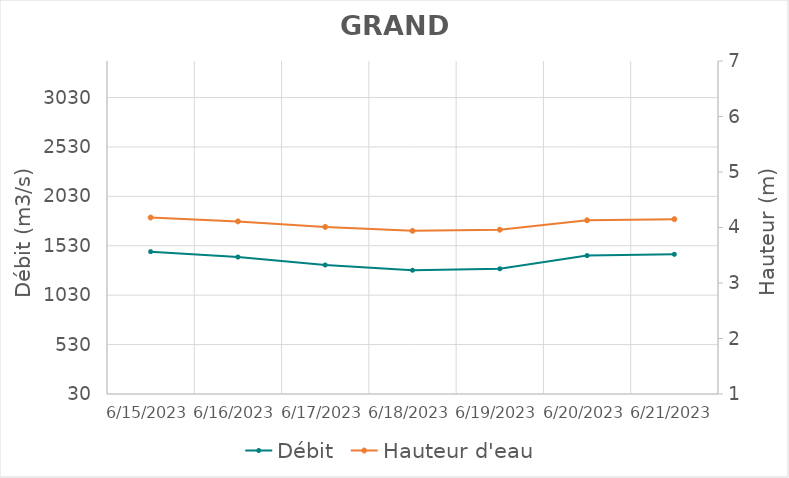
| Category | Débit |
|---|---|
| 6/29/22 | 2068.21 |
| 6/28/22 | 1854.04 |
| 6/27/22 | 1893.75 |
| 6/26/22 | 2018.73 |
| 6/25/22 | 2099.57 |
| 6/24/22 | 2095.71 |
| 6/23/22 | 2180 |